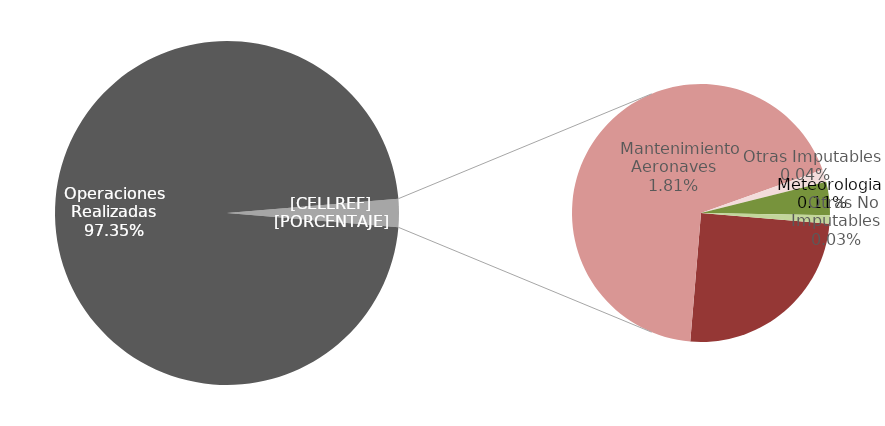
| Category | Series 0 |
|---|---|
| Operaciones Realizadas | 7047 |
|    Operaciones Aerolinea | 48 |
|    Mantenimiento Aeronaves | 131 |
|    Otras Imputables | 3 |
|    Meteorologia | 8 |
|    Otras No Imputables | 2 |